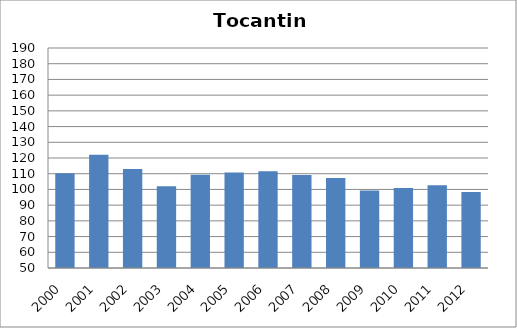
| Category | BCG |
|---|---|
| 2000.0 | 110.23 |
| 2001.0 | 122.08 |
| 2002.0 | 113.06 |
| 2003.0 | 102.09 |
| 2004.0 | 109.27 |
| 2005.0 | 110.81 |
| 2006.0 | 111.61 |
| 2007.0 | 109.12 |
| 2008.0 | 107.3 |
| 2009.0 | 99.28 |
| 2010.0 | 100.84 |
| 2011.0 | 102.6 |
| 2012.0 | 98.29 |